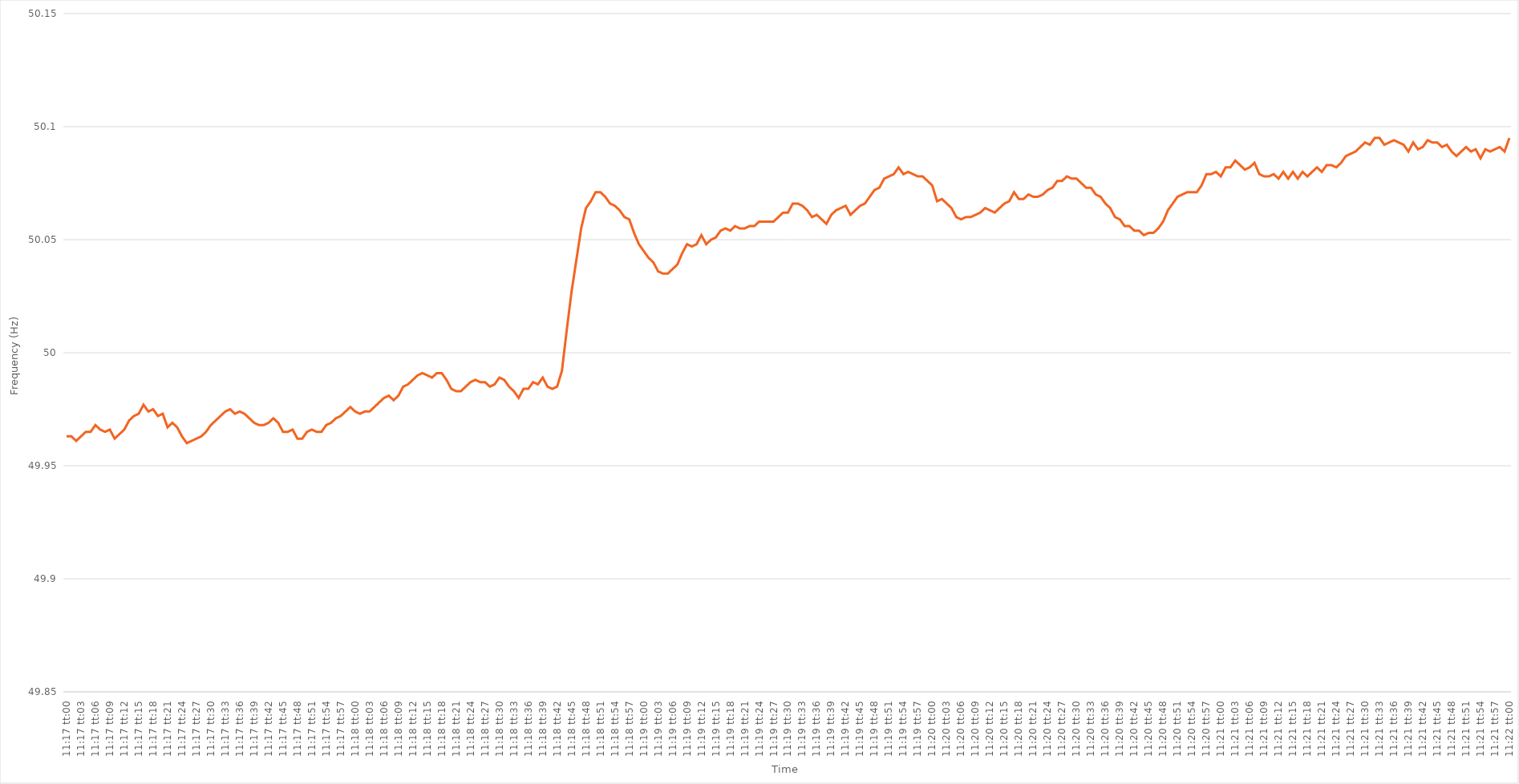
| Category | Series 0 |
|---|---|
| 0.4701388888888889 | 49.963 |
| 0.470150462962963 | 49.963 |
| 0.470162037037037 | 49.961 |
| 0.47017361111111117 | 49.963 |
| 0.4701851851851852 | 49.965 |
| 0.47019675925925924 | 49.965 |
| 0.47020833333333334 | 49.968 |
| 0.4702199074074074 | 49.966 |
| 0.4702314814814815 | 49.965 |
| 0.4702430555555555 | 49.966 |
| 0.47025462962962966 | 49.962 |
| 0.4702662037037037 | 49.964 |
| 0.4702777777777778 | 49.966 |
| 0.47028935185185183 | 49.97 |
| 0.47030092592592593 | 49.972 |
| 0.47031249999999997 | 49.973 |
| 0.4703240740740741 | 49.977 |
| 0.47033564814814816 | 49.974 |
| 0.47034722222222225 | 49.975 |
| 0.4703587962962963 | 49.972 |
| 0.4703703703703704 | 49.973 |
| 0.4703819444444444 | 49.967 |
| 0.47039351851851857 | 49.969 |
| 0.4704050925925926 | 49.967 |
| 0.47041666666666665 | 49.963 |
| 0.47042824074074074 | 49.96 |
| 0.4704398148148148 | 49.961 |
| 0.4704513888888889 | 49.962 |
| 0.4704629629629629 | 49.963 |
| 0.47047453703703707 | 49.965 |
| 0.4704861111111111 | 49.968 |
| 0.4704976851851852 | 49.97 |
| 0.47050925925925924 | 49.972 |
| 0.47052083333333333 | 49.974 |
| 0.47053240740740737 | 49.975 |
| 0.4705439814814815 | 49.973 |
| 0.47055555555555556 | 49.974 |
| 0.47056712962962965 | 49.973 |
| 0.4705787037037037 | 49.971 |
| 0.4705902777777778 | 49.969 |
| 0.4706018518518518 | 49.968 |
| 0.470613425925926 | 49.968 |
| 0.470625 | 49.969 |
| 0.47063657407407405 | 49.971 |
| 0.47064814814814815 | 49.969 |
| 0.4706597222222222 | 49.965 |
| 0.4706712962962963 | 49.965 |
| 0.4706828703703703 | 49.966 |
| 0.47069444444444447 | 49.962 |
| 0.4707060185185185 | 49.962 |
| 0.4707175925925926 | 49.965 |
| 0.47072916666666664 | 49.966 |
| 0.47074074074074074 | 49.965 |
| 0.4707523148148148 | 49.965 |
| 0.4707638888888889 | 49.968 |
| 0.47077546296296297 | 49.969 |
| 0.47078703703703706 | 49.971 |
| 0.4707986111111111 | 49.972 |
| 0.4708101851851852 | 49.974 |
| 0.47082175925925923 | 49.976 |
| 0.4708333333333334 | 49.974 |
| 0.4708449074074074 | 49.973 |
| 0.4708564814814815 | 49.974 |
| 0.47086805555555555 | 49.974 |
| 0.47087962962962965 | 49.976 |
| 0.4708912037037037 | 49.978 |
| 0.4709027777777777 | 49.98 |
| 0.4709143518518519 | 49.981 |
| 0.4709259259259259 | 49.979 |
| 0.4709375 | 49.981 |
| 0.47094907407407405 | 49.985 |
| 0.47096064814814814 | 49.986 |
| 0.4709722222222222 | 49.988 |
| 0.47098379629629633 | 49.99 |
| 0.47099537037037037 | 49.991 |
| 0.47100694444444446 | 49.99 |
| 0.4710185185185185 | 49.989 |
| 0.4710300925925926 | 49.991 |
| 0.47104166666666664 | 49.991 |
| 0.4710532407407408 | 49.988 |
| 0.4710648148148148 | 49.984 |
| 0.4710763888888889 | 49.983 |
| 0.47108796296296296 | 49.983 |
| 0.47109953703703705 | 49.985 |
| 0.4711111111111111 | 49.987 |
| 0.47112268518518513 | 49.988 |
| 0.4711342592592593 | 49.987 |
| 0.4711458333333333 | 49.987 |
| 0.4711574074074074 | 49.985 |
| 0.47116898148148145 | 49.986 |
| 0.47118055555555555 | 49.989 |
| 0.4711921296296296 | 49.988 |
| 0.47120370370370374 | 49.985 |
| 0.4712152777777778 | 49.983 |
| 0.47122685185185187 | 49.98 |
| 0.4712384259259259 | 49.984 |
| 0.47125 | 49.984 |
| 0.47126157407407404 | 49.987 |
| 0.4712731481481482 | 49.986 |
| 0.47128472222222223 | 49.989 |
| 0.4712962962962963 | 49.985 |
| 0.47130787037037036 | 49.984 |
| 0.47131944444444446 | 49.985 |
| 0.4713310185185185 | 49.992 |
| 0.47134259259259265 | 50.01 |
| 0.4713541666666667 | 50.027 |
| 0.4713657407407407 | 50.041 |
| 0.4713773148148148 | 50.055 |
| 0.47138888888888886 | 50.064 |
| 0.47140046296296295 | 50.067 |
| 0.471412037037037 | 50.071 |
| 0.47142361111111114 | 50.071 |
| 0.4714351851851852 | 50.069 |
| 0.4714467592592593 | 50.066 |
| 0.4714583333333333 | 50.065 |
| 0.4714699074074074 | 50.063 |
| 0.47148148148148145 | 50.06 |
| 0.4714930555555556 | 50.059 |
| 0.47150462962962963 | 50.053 |
| 0.47151620370370373 | 50.048 |
| 0.47152777777777777 | 50.045 |
| 0.47153935185185186 | 50.042 |
| 0.4715509259259259 | 50.04 |
| 0.47156250000000005 | 50.036 |
| 0.4715740740740741 | 50.035 |
| 0.4715856481481482 | 50.035 |
| 0.4715972222222222 | 50.037 |
| 0.47160879629629626 | 50.039 |
| 0.47162037037037036 | 50.044 |
| 0.4716319444444444 | 50.048 |
| 0.47164351851851855 | 50.047 |
| 0.4716550925925926 | 50.048 |
| 0.4716666666666667 | 50.052 |
| 0.4716782407407407 | 50.048 |
| 0.4716898148148148 | 50.05 |
| 0.47170138888888885 | 50.051 |
| 0.471712962962963 | 50.054 |
| 0.47172453703703704 | 50.055 |
| 0.47173611111111113 | 50.054 |
| 0.4717476851851852 | 50.056 |
| 0.47175925925925927 | 50.055 |
| 0.4717708333333333 | 50.055 |
| 0.47178240740740746 | 50.056 |
| 0.4717939814814815 | 50.056 |
| 0.4718055555555556 | 50.058 |
| 0.47181712962962963 | 50.058 |
| 0.47182870370370367 | 50.058 |
| 0.47184027777777776 | 50.058 |
| 0.4718518518518518 | 50.06 |
| 0.47186342592592595 | 50.062 |
| 0.471875 | 50.062 |
| 0.4718865740740741 | 50.066 |
| 0.4718981481481481 | 50.066 |
| 0.4719097222222222 | 50.065 |
| 0.47192129629629626 | 50.063 |
| 0.4719328703703704 | 50.06 |
| 0.47194444444444444 | 50.061 |
| 0.47195601851851854 | 50.059 |
| 0.4719675925925926 | 50.057 |
| 0.47197916666666667 | 50.061 |
| 0.4719907407407407 | 50.063 |
| 0.47200231481481486 | 50.064 |
| 0.4720138888888889 | 50.065 |
| 0.472025462962963 | 50.061 |
| 0.47203703703703703 | 50.063 |
| 0.4720486111111111 | 50.065 |
| 0.47206018518518517 | 50.066 |
| 0.4720717592592593 | 50.069 |
| 0.47208333333333335 | 50.072 |
| 0.4720949074074074 | 50.073 |
| 0.4721064814814815 | 50.077 |
| 0.4721180555555555 | 50.078 |
| 0.4721296296296296 | 50.079 |
| 0.47214120370370366 | 50.082 |
| 0.4721527777777778 | 50.079 |
| 0.47216435185185185 | 50.08 |
| 0.47217592592592594 | 50.079 |
| 0.4721875 | 50.078 |
| 0.4721990740740741 | 50.078 |
| 0.4722106481481481 | 50.076 |
| 0.47222222222222227 | 50.074 |
| 0.4722337962962963 | 50.067 |
| 0.4722453703703704 | 50.068 |
| 0.47225694444444444 | 50.066 |
| 0.47226851851851853 | 50.064 |
| 0.47228009259259257 | 50.06 |
| 0.4722916666666667 | 50.059 |
| 0.47230324074074076 | 50.06 |
| 0.4723148148148148 | 50.06 |
| 0.4723263888888889 | 50.061 |
| 0.47233796296296293 | 50.062 |
| 0.472349537037037 | 50.064 |
| 0.47236111111111106 | 50.063 |
| 0.4723726851851852 | 50.062 |
| 0.47238425925925925 | 50.064 |
| 0.47239583333333335 | 50.066 |
| 0.4724074074074074 | 50.067 |
| 0.4724189814814815 | 50.071 |
| 0.4724305555555555 | 50.068 |
| 0.47244212962962967 | 50.068 |
| 0.4724537037037037 | 50.07 |
| 0.4724652777777778 | 50.069 |
| 0.47247685185185184 | 50.069 |
| 0.47248842592592594 | 50.07 |
| 0.4725 | 50.072 |
| 0.4725115740740741 | 50.073 |
| 0.47252314814814816 | 50.076 |
| 0.4725347222222222 | 50.076 |
| 0.4725462962962963 | 50.078 |
| 0.47255787037037034 | 50.077 |
| 0.47256944444444443 | 50.077 |
| 0.47258101851851847 | 50.075 |
| 0.4725925925925926 | 50.073 |
| 0.47260416666666666 | 50.073 |
| 0.47261574074074075 | 50.07 |
| 0.4726273148148148 | 50.069 |
| 0.4726388888888889 | 50.066 |
| 0.4726504629629629 | 50.064 |
| 0.4726620370370371 | 50.06 |
| 0.4726736111111111 | 50.059 |
| 0.4726851851851852 | 50.056 |
| 0.47269675925925925 | 50.056 |
| 0.47270833333333334 | 50.054 |
| 0.4727199074074074 | 50.054 |
| 0.47273148148148153 | 50.052 |
| 0.47274305555555557 | 50.053 |
| 0.47275462962962966 | 50.053 |
| 0.4727662037037037 | 50.055 |
| 0.4727777777777778 | 50.058 |
| 0.47278935185185184 | 50.063 |
| 0.4728009259259259 | 50.066 |
| 0.4728125 | 50.069 |
| 0.47282407407407406 | 50.07 |
| 0.47283564814814816 | 50.071 |
| 0.4728472222222222 | 50.071 |
| 0.4728587962962963 | 50.071 |
| 0.47287037037037033 | 50.074 |
| 0.4728819444444445 | 50.079 |
| 0.4728935185185185 | 50.079 |
| 0.4729050925925926 | 50.08 |
| 0.47291666666666665 | 50.078 |
| 0.47292824074074075 | 50.082 |
| 0.4729398148148148 | 50.082 |
| 0.47295138888888894 | 50.085 |
| 0.472962962962963 | 50.083 |
| 0.47297453703703707 | 50.081 |
| 0.4729861111111111 | 50.082 |
| 0.4729976851851852 | 50.084 |
| 0.47300925925925924 | 50.079 |
| 0.4730208333333333 | 50.078 |
| 0.47303240740740743 | 50.078 |
| 0.47304398148148147 | 50.079 |
| 0.47305555555555556 | 50.077 |
| 0.4730671296296296 | 50.08 |
| 0.4730787037037037 | 50.077 |
| 0.47309027777777773 | 50.08 |
| 0.4731018518518519 | 50.077 |
| 0.4731134259259259 | 50.08 |
| 0.473125 | 50.078 |
| 0.47313657407407406 | 50.08 |
| 0.47314814814814815 | 50.082 |
| 0.4731597222222222 | 50.08 |
| 0.47317129629629634 | 50.083 |
| 0.4731828703703704 | 50.083 |
| 0.4731944444444445 | 50.082 |
| 0.4732060185185185 | 50.084 |
| 0.4732175925925926 | 50.087 |
| 0.47322916666666665 | 50.088 |
| 0.4732407407407407 | 50.089 |
| 0.47325231481481483 | 50.091 |
| 0.4732638888888889 | 50.093 |
| 0.47327546296296297 | 50.092 |
| 0.473287037037037 | 50.095 |
| 0.4732986111111111 | 50.095 |
| 0.47331018518518514 | 50.092 |
| 0.4733217592592593 | 50.093 |
| 0.47333333333333333 | 50.094 |
| 0.4733449074074074 | 50.093 |
| 0.47335648148148146 | 50.092 |
| 0.47336805555555556 | 50.089 |
| 0.4733796296296296 | 50.093 |
| 0.47339120370370374 | 50.09 |
| 0.4734027777777778 | 50.091 |
| 0.4734143518518519 | 50.094 |
| 0.4734259259259259 | 50.093 |
| 0.4734375 | 50.093 |
| 0.47344907407407405 | 50.091 |
| 0.4734606481481482 | 50.092 |
| 0.47347222222222224 | 50.089 |
| 0.47348379629629633 | 50.087 |
| 0.47349537037037037 | 50.089 |
| 0.4735069444444444 | 50.091 |
| 0.4735185185185185 | 50.089 |
| 0.47353009259259254 | 50.09 |
| 0.4735416666666667 | 50.086 |
| 0.47355324074074073 | 50.09 |
| 0.4735648148148148 | 50.089 |
| 0.47357638888888887 | 50.09 |
| 0.47358796296296296 | 50.091 |
| 0.473599537037037 | 50.089 |
| 0.47361111111111115 | 50.095 |